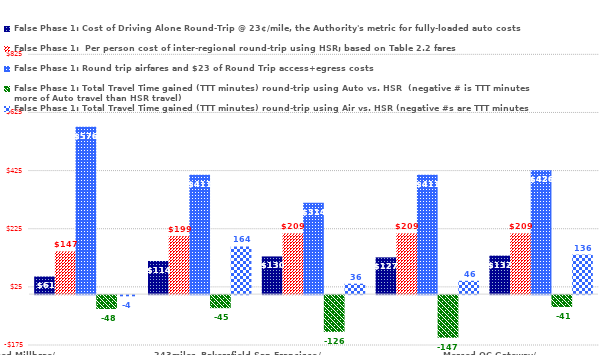
| Category | False Phase 1: Cost of Driving Alone Round-Trip @ 23¢/mile, the Authority's metric for fully-loaded auto costs | False Phase 1:  Per person cost of inter-regional round-trip using HSR; based on Table 2.2 fares | False Phase 1: Round trip airfares and $23 of Round Trip access+egress costs | False Phase 1: Total Travel Time gained (TTT minutes) round-trip using Auto vs. HSR  (negative # is TTT minutes more of Auto travel than HSR travel) | False Phase 1: Total Travel Time gained (TTT minutes) round-trip using Air vs. HSR (negative #s are TTT minutes saved by HSR travelers over Air travelers) |
|---|---|---|---|---|---|
| Merced-Millbrae/                                 243miles | 60.72 | 147 | 576 | -47.6 | -4 |
| Fresno-Anaheim/                                         294miles | 114.08 | 199 | 411 | -44.8 | 164 |
| Bakersfield-San Francisco/                                                306miles | 129.72 | 209 | 314 | -126.3 | 36 |
| Merced-Los Angeles/                                                                  326miles | 126.5 | 209 | 411 | -146.7 | 46 |
| Merced-OC Gateway/                                      340miles | 132.48 | 209 | 426 | -40.6 | 136 |